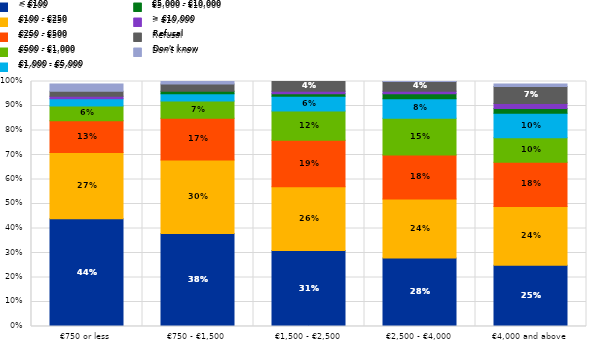
| Category | < €100 | €100 - €250 | €250 - €500 | €500 - €1,000 | €1,000 - €5,000 | €5,000 - €10,000 | > €10,000 | Refusal | Don't know |
|---|---|---|---|---|---|---|---|---|---|
| €750 or less | 0.44 | 0.27 | 0.13 | 0.06 | 0.03 | 0 | 0.01 | 0.02 | 0.03 |
| €750 - €1,500 | 0.38 | 0.3 | 0.17 | 0.07 | 0.03 | 0.01 | 0 | 0.03 | 0.01 |
| €1,500 - €2,500 | 0.31 | 0.26 | 0.19 | 0.12 | 0.06 | 0.01 | 0.01 | 0.04 | 0 |
| €2,500 - €4,000 | 0.28 | 0.24 | 0.18 | 0.15 | 0.08 | 0.02 | 0.01 | 0.04 | 0.01 |
| €4,000 and above | 0.25 | 0.24 | 0.18 | 0.1 | 0.1 | 0.02 | 0.02 | 0.07 | 0.01 |